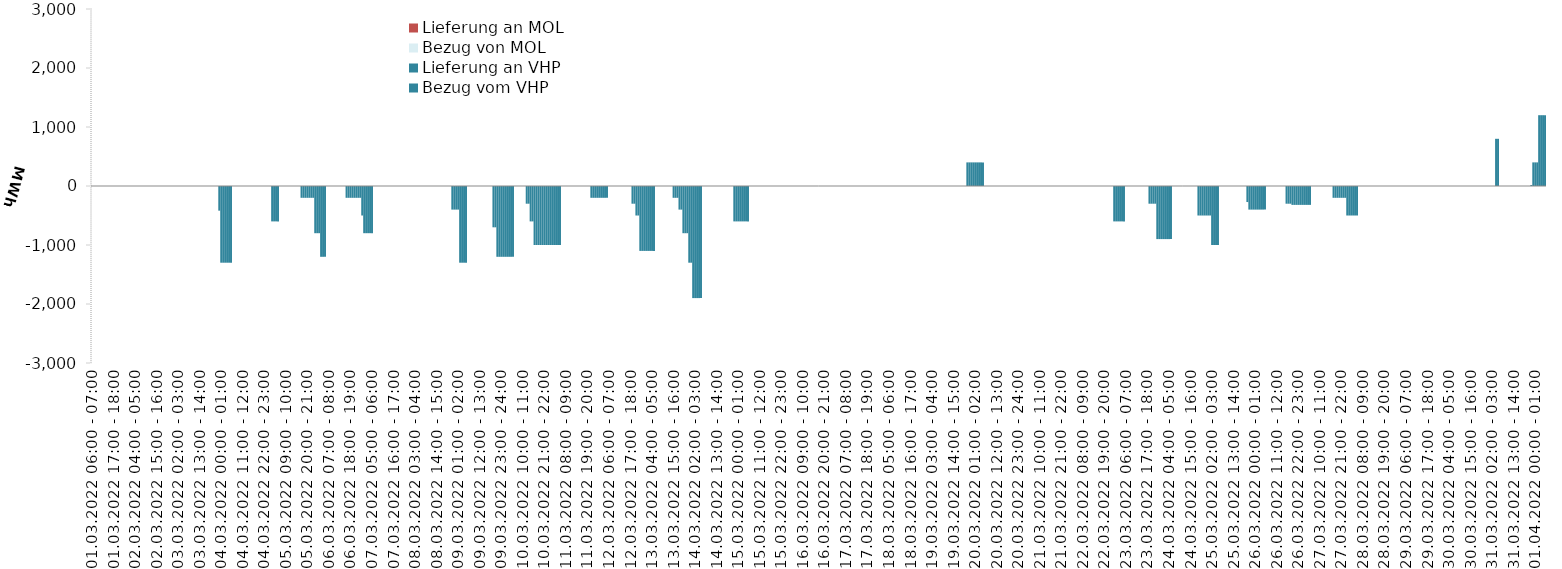
| Category | Bezug vom VHP | Lieferung an VHP | Bezug von MOL | Lieferung an MOL |
|---|---|---|---|---|
| 01.03.2022 06:00 - 07:00 | 0 | 0 | 0 | 0 |
| 01.03.2022 07:00 - 08:00 | 0 | 0 | 0 | 0 |
| 01.03.2022 08:00 - 09:00 | 0 | 0 | 0 | 0 |
| 01.03.2022 09:00 - 10:00 | 0 | 0 | 0 | 0 |
| 01.03.2022 10:00 - 11:00 | 0 | 0 | 0 | 0 |
| 01.03.2022 11:00 - 12:00 | 0 | 0 | 0 | 0 |
| 01.03.2022 12:00 - 13:00 | 0 | 0 | 0 | 0 |
| 01.03.2022 13:00 - 14:00 | 0 | 0 | 0 | 0 |
| 01.03.2022 14:00 - 15:00 | 0 | 0 | 0 | 0 |
| 01.03.2022 15:00 - 16:00 | 0 | 0 | 0 | 0 |
| 01.03.2022 16:00 - 17:00 | 0 | 0 | 0 | 0 |
| 01.03.2022 17:00 - 18:00 | 0 | 0 | 0 | 0 |
| 01.03.2022 18:00 - 19:00 | 0 | 0 | 0 | 0 |
| 01.03.2022 19:00 - 20:00 | 0 | 0 | 0 | 0 |
| 01.03.2022 20:00 - 21:00 | 0 | 0 | 0 | 0 |
| 01.03.2022 21:00 - 22:00 | 0 | 0 | 0 | 0 |
| 01.03.2022 22:00 - 23:00 | 0 | 0 | 0 | 0 |
| 01.03.2022 23:00 - 24:00 | 0 | 0 | 0 | 0 |
| 02.03.2022 00:00 - 01:00 | 0 | 0 | 0 | 0 |
| 02.03.2022 01:00 - 02:00 | 0 | 0 | 0 | 0 |
| 02.03.2022 02:00 - 03:00 | 0 | 0 | 0 | 0 |
| 02.03.2022 03:00 - 04:00 | 0 | 0 | 0 | 0 |
| 02.03.2022 04:00 - 05:00 | 0 | 0 | 0 | 0 |
| 02.03.2022 05:00 - 06:00 | 0 | 0 | 0 | 0 |
| 02.03.2022 06:00 - 07:00 | 0 | 0 | 0 | 0 |
| 02.03.2022 07:00 - 08:00 | 0 | 0 | 0 | 0 |
| 02.03.2022 08:00 - 09:00 | 0 | 0 | 0 | 0 |
| 02.03.2022 09:00 - 10:00 | 0 | 0 | 0 | 0 |
| 02.03.2022 10:00 - 11:00 | 0 | 0 | 0 | 0 |
| 02.03.2022 11:00 - 12:00 | 0 | 0 | 0 | 0 |
| 02.03.2022 12:00 - 13:00 | 0 | 0 | 0 | 0 |
| 02.03.2022 13:00 - 14:00 | 0 | 0 | 0 | 0 |
| 02.03.2022 14:00 - 15:00 | 0 | 0 | 0 | 0 |
| 02.03.2022 15:00 - 16:00 | 0 | 0 | 0 | 0 |
| 02.03.2022 16:00 - 17:00 | 0 | 0 | 0 | 0 |
| 02.03.2022 17:00 - 18:00 | 0 | 0 | 0 | 0 |
| 02.03.2022 18:00 - 19:00 | 0 | 0 | 0 | 0 |
| 02.03.2022 19:00 - 20:00 | 0 | 0 | 0 | 0 |
| 02.03.2022 20:00 - 21:00 | 0 | 0 | 0 | 0 |
| 02.03.2022 21:00 - 22:00 | 0 | 0 | 0 | 0 |
| 02.03.2022 22:00 - 23:00 | 0 | 0 | 0 | 0 |
| 02.03.2022 23:00 - 24:00 | 0 | 0 | 0 | 0 |
| 03.03.2022 00:00 - 01:00 | 0 | 0 | 0 | 0 |
| 03.03.2022 01:00 - 02:00 | 0 | 0 | 0 | 0 |
| 03.03.2022 02:00 - 03:00 | 0 | 0 | 0 | 0 |
| 03.03.2022 03:00 - 04:00 | 0 | 0 | 0 | 0 |
| 03.03.2022 04:00 - 05:00 | 0 | 0 | 0 | 0 |
| 03.03.2022 05:00 - 06:00 | 0 | 0 | 0 | 0 |
| 03.03.2022 06:00 - 07:00 | 0 | 0 | 0 | 0 |
| 03.03.2022 07:00 - 08:00 | 0 | 0 | 0 | 0 |
| 03.03.2022 08:00 - 09:00 | 0 | 0 | 0 | 0 |
| 03.03.2022 09:00 - 10:00 | 0 | 0 | 0 | 0 |
| 03.03.2022 10:00 - 11:00 | 0 | 0 | 0 | 0 |
| 03.03.2022 11:00 - 12:00 | 0 | 0 | 0 | 0 |
| 03.03.2022 12:00 - 13:00 | 0 | 0 | 0 | 0 |
| 03.03.2022 13:00 - 14:00 | 0 | 0 | 0 | 0 |
| 03.03.2022 14:00 - 15:00 | 0 | 0 | 0 | 0 |
| 03.03.2022 15:00 - 16:00 | 0 | 0 | 0 | 0 |
| 03.03.2022 16:00 - 17:00 | 0 | 0 | 0 | 0 |
| 03.03.2022 17:00 - 18:00 | 0 | 0 | 0 | 0 |
| 03.03.2022 18:00 - 19:00 | 0 | 0 | 0 | 0 |
| 03.03.2022 19:00 - 20:00 | 0 | 0 | 0 | 0 |
| 03.03.2022 20:00 - 21:00 | 0 | 0 | 0 | 0 |
| 03.03.2022 21:00 - 22:00 | 0 | 0 | 0 | 0 |
| 03.03.2022 22:00 - 23:00 | 0 | 0 | 0 | 0 |
| 03.03.2022 23:00 - 24:00 | 0 | -418 | 0 | 0 |
| 04.03.2022 00:00 - 01:00 | 0 | -1300 | 0 | 0 |
| 04.03.2022 01:00 - 02:00 | 0 | -1300 | 0 | 0 |
| 04.03.2022 02:00 - 03:00 | 0 | -1300 | 0 | 0 |
| 04.03.2022 03:00 - 04:00 | 0 | -1300 | 0 | 0 |
| 04.03.2022 04:00 - 05:00 | 0 | -1300 | 0 | 0 |
| 04.03.2022 05:00 - 06:00 | 0 | -1300 | 0 | 0 |
| 04.03.2022 06:00 - 07:00 | 0 | 0 | 0 | 0 |
| 04.03.2022 07:00 - 08:00 | 0 | 0 | 0 | 0 |
| 04.03.2022 08:00 - 09:00 | 0 | 0 | 0 | 0 |
| 04.03.2022 09:00 - 10:00 | 0 | 0 | 0 | 0 |
| 04.03.2022 10:00 - 11:00 | 0 | 0 | 0 | 0 |
| 04.03.2022 11:00 - 12:00 | 0 | 0 | 0 | 0 |
| 04.03.2022 12:00 - 13:00 | 0 | 0 | 0 | 0 |
| 04.03.2022 13:00 - 14:00 | 0 | 0 | 0 | 0 |
| 04.03.2022 14:00 - 15:00 | 0 | 0 | 0 | 0 |
| 04.03.2022 15:00 - 16:00 | 0 | 0 | 0 | 0 |
| 04.03.2022 16:00 - 17:00 | 0 | 0 | 0 | 0 |
| 04.03.2022 17:00 - 18:00 | 0 | 0 | 0 | 0 |
| 04.03.2022 18:00 - 19:00 | 0 | 0 | 0 | 0 |
| 04.03.2022 19:00 - 20:00 | 0 | 0 | 0 | 0 |
| 04.03.2022 20:00 - 21:00 | 0 | 0 | 0 | 0 |
| 04.03.2022 21:00 - 22:00 | 0 | 0 | 0 | 0 |
| 04.03.2022 22:00 - 23:00 | 0 | 0 | 0 | 0 |
| 04.03.2022 23:00 - 24:00 | 0 | 0 | 0 | 0 |
| 05.03.2022 00:00 - 01:00 | 0 | 0 | 0 | 0 |
| 05.03.2022 01:00 - 02:00 | 0 | 0 | 0 | 0 |
| 05.03.2022 02:00 - 03:00 | 0 | -600 | 0 | 0 |
| 05.03.2022 03:00 - 04:00 | 0 | -600 | 0 | 0 |
| 05.03.2022 04:00 - 05:00 | 0 | -600 | 0 | 0 |
| 05.03.2022 05:00 - 06:00 | 0 | -600 | 0 | 0 |
| 05.03.2022 06:00 - 07:00 | 0 | 0 | 0 | 0 |
| 05.03.2022 07:00 - 08:00 | 0 | 0 | 0 | 0 |
| 05.03.2022 08:00 - 09:00 | 0 | 0 | 0 | 0 |
| 05.03.2022 09:00 - 10:00 | 0 | 0 | 0 | 0 |
| 05.03.2022 10:00 - 11:00 | 0 | 0 | 0 | 0 |
| 05.03.2022 11:00 - 12:00 | 0 | 0 | 0 | 0 |
| 05.03.2022 12:00 - 13:00 | 0 | 0 | 0 | 0 |
| 05.03.2022 13:00 - 14:00 | 0 | 0 | 0 | 0 |
| 05.03.2022 14:00 - 15:00 | 0 | 0 | 0 | 0 |
| 05.03.2022 15:00 - 16:00 | 0 | 0 | 0 | 0 |
| 05.03.2022 16:00 - 17:00 | 0 | 0 | 0 | 0 |
| 05.03.2022 17:00 - 18:00 | 0 | -200 | 0 | 0 |
| 05.03.2022 18:00 - 19:00 | 0 | -200 | 0 | 0 |
| 05.03.2022 19:00 - 20:00 | 0 | -200 | 0 | 0 |
| 05.03.2022 20:00 - 21:00 | 0 | -200 | 0 | 0 |
| 05.03.2022 21:00 - 22:00 | 0 | -200 | 0 | 0 |
| 05.03.2022 22:00 - 23:00 | 0 | -200 | 0 | 0 |
| 05.03.2022 23:00 - 24:00 | 0 | -200 | 0 | 0 |
| 06.03.2022 00:00 - 01:00 | 0 | -800 | 0 | 0 |
| 06.03.2022 01:00 - 02:00 | 0 | -800 | 0 | 0 |
| 06.03.2022 02:00 - 03:00 | 0 | -800 | 0 | 0 |
| 06.03.2022 03:00 - 04:00 | 0 | -1200 | 0 | 0 |
| 06.03.2022 04:00 - 05:00 | 0 | -1200 | 0 | 0 |
| 06.03.2022 05:00 - 06:00 | 0 | -1200 | 0 | 0 |
| 06.03.2022 06:00 - 07:00 | 0 | 0 | 0 | 0 |
| 06.03.2022 07:00 - 08:00 | 0 | 0 | 0 | 0 |
| 06.03.2022 08:00 - 09:00 | 0 | 0 | 0 | 0 |
| 06.03.2022 09:00 - 10:00 | 0 | 0 | 0 | 0 |
| 06.03.2022 10:00 - 11:00 | 0 | 0 | 0 | 0 |
| 06.03.2022 11:00 - 12:00 | 0 | 0 | 0 | 0 |
| 06.03.2022 12:00 - 13:00 | 0 | 0 | 0 | 0 |
| 06.03.2022 13:00 - 14:00 | 0 | 0 | 0 | 0 |
| 06.03.2022 14:00 - 15:00 | 0 | 0 | 0 | 0 |
| 06.03.2022 15:00 - 16:00 | 0 | 0 | 0 | 0 |
| 06.03.2022 16:00 - 17:00 | 0 | -200 | 0 | 0 |
| 06.03.2022 17:00 - 18:00 | 0 | -200 | 0 | 0 |
| 06.03.2022 18:00 - 19:00 | 0 | -200 | 0 | 0 |
| 06.03.2022 19:00 - 20:00 | 0 | -200 | 0 | 0 |
| 06.03.2022 20:00 - 21:00 | 0 | -200 | 0 | 0 |
| 06.03.2022 21:00 - 22:00 | 0 | -200 | 0 | 0 |
| 06.03.2022 22:00 - 23:00 | 0 | -200 | 0 | 0 |
| 06.03.2022 23:00 - 24:00 | 0 | -200 | 0 | 0 |
| 07.03.2022 00:00 - 01:00 | 0 | -500 | 0 | 0 |
| 07.03.2022 01:00 - 02:00 | 0 | -800 | 0 | 0 |
| 07.03.2022 02:00 - 03:00 | 0 | -800 | 0 | 0 |
| 07.03.2022 03:00 - 04:00 | 0 | -800 | 0 | 0 |
| 07.03.2022 04:00 - 05:00 | 0 | -800 | 0 | 0 |
| 07.03.2022 05:00 - 06:00 | 0 | -800 | 0 | 0 |
| 07.03.2022 06:00 - 07:00 | 0 | 0 | 0 | 0 |
| 07.03.2022 07:00 - 08:00 | 0 | 0 | 0 | 0 |
| 07.03.2022 08:00 - 09:00 | 0 | 0 | 0 | 0 |
| 07.03.2022 09:00 - 10:00 | 0 | 0 | 0 | 0 |
| 07.03.2022 10:00 - 11:00 | 0 | 0 | 0 | 0 |
| 07.03.2022 11:00 - 12:00 | 0 | 0 | 0 | 0 |
| 07.03.2022 12:00 - 13:00 | 0 | 0 | 0 | 0 |
| 07.03.2022 13:00 - 14:00 | 0 | 0 | 0 | 0 |
| 07.03.2022 14:00 - 15:00 | 0 | 0 | 0 | 0 |
| 07.03.2022 15:00 - 16:00 | 0 | 0 | 0 | 0 |
| 07.03.2022 16:00 - 17:00 | 0 | 0 | 0 | 0 |
| 07.03.2022 17:00 - 18:00 | 0 | 0 | 0 | 0 |
| 07.03.2022 18:00 - 19:00 | 0 | 0 | 0 | 0 |
| 07.03.2022 19:00 - 20:00 | 0 | 0 | 0 | 0 |
| 07.03.2022 20:00 - 21:00 | 0 | 0 | 0 | 0 |
| 07.03.2022 21:00 - 22:00 | 0 | 0 | 0 | 0 |
| 07.03.2022 22:00 - 23:00 | 0 | 0 | 0 | 0 |
| 07.03.2022 23:00 - 24:00 | 0 | 0 | 0 | 0 |
| 08.03.2022 00:00 - 01:00 | 0 | 0 | 0 | 0 |
| 08.03.2022 01:00 - 02:00 | 0 | 0 | 0 | 0 |
| 08.03.2022 02:00 - 03:00 | 0 | 0 | 0 | 0 |
| 08.03.2022 03:00 - 04:00 | 0 | 0 | 0 | 0 |
| 08.03.2022 04:00 - 05:00 | 0 | 0 | 0 | 0 |
| 08.03.2022 05:00 - 06:00 | 0 | 0 | 0 | 0 |
| 08.03.2022 06:00 - 07:00 | 0 | 0 | 0 | 0 |
| 08.03.2022 07:00 - 08:00 | 0 | 0 | 0 | 0 |
| 08.03.2022 08:00 - 09:00 | 0 | 0 | 0 | 0 |
| 08.03.2022 09:00 - 10:00 | 0 | 0 | 0 | 0 |
| 08.03.2022 10:00 - 11:00 | 0 | 0 | 0 | 0 |
| 08.03.2022 11:00 - 12:00 | 0 | 0 | 0 | 0 |
| 08.03.2022 12:00 - 13:00 | 0 | 0 | 0 | 0 |
| 08.03.2022 13:00 - 14:00 | 0 | 0 | 0 | 0 |
| 08.03.2022 14:00 - 15:00 | 0 | 0 | 0 | 0 |
| 08.03.2022 15:00 - 16:00 | 0 | 0 | 0 | 0 |
| 08.03.2022 16:00 - 17:00 | 0 | 0 | 0 | 0 |
| 08.03.2022 17:00 - 18:00 | 0 | 0 | 0 | 0 |
| 08.03.2022 18:00 - 19:00 | 0 | 0 | 0 | 0 |
| 08.03.2022 19:00 - 20:00 | 0 | 0 | 0 | 0 |
| 08.03.2022 20:00 - 21:00 | 0 | 0 | 0 | 0 |
| 08.03.2022 21:00 - 22:00 | 0 | 0 | 0 | 0 |
| 08.03.2022 22:00 - 23:00 | 0 | -400 | 0 | 0 |
| 08.03.2022 23:00 - 24:00 | 0 | -400 | 0 | 0 |
| 09.03.2022 00:00 - 01:00 | 0 | -400 | 0 | 0 |
| 09.03.2022 01:00 - 02:00 | 0 | -400 | 0 | 0 |
| 09.03.2022 02:00 - 03:00 | 0 | -1300 | 0 | 0 |
| 09.03.2022 03:00 - 04:00 | 0 | -1300 | 0 | 0 |
| 09.03.2022 04:00 - 05:00 | 0 | -1300 | 0 | 0 |
| 09.03.2022 05:00 - 06:00 | 0 | -1300 | 0 | 0 |
| 09.03.2022 06:00 - 07:00 | 0 | 0 | 0 | 0 |
| 09.03.2022 07:00 - 08:00 | 0 | 0 | 0 | 0 |
| 09.03.2022 08:00 - 09:00 | 0 | 0 | 0 | 0 |
| 09.03.2022 09:00 - 10:00 | 0 | 0 | 0 | 0 |
| 09.03.2022 10:00 - 11:00 | 0 | 0 | 0 | 0 |
| 09.03.2022 11:00 - 12:00 | 0 | 0 | 0 | 0 |
| 09.03.2022 12:00 - 13:00 | 0 | 0 | 0 | 0 |
| 09.03.2022 13:00 - 14:00 | 0 | 0 | 0 | 0 |
| 09.03.2022 14:00 - 15:00 | 0 | 0 | 0 | 0 |
| 09.03.2022 15:00 - 16:00 | 0 | 0 | 0 | 0 |
| 09.03.2022 16:00 - 17:00 | 0 | 0 | 0 | 0 |
| 09.03.2022 17:00 - 18:00 | 0 | 0 | 0 | 0 |
| 09.03.2022 18:00 - 19:00 | 0 | 0 | 0 | 0 |
| 09.03.2022 19:00 - 20:00 | 0 | -700 | 0 | 0 |
| 09.03.2022 20:00 - 21:00 | 0 | -700 | 0 | 0 |
| 09.03.2022 21:00 - 22:00 | 0 | -1200 | 0 | 0 |
| 09.03.2022 22:00 - 23:00 | 0 | -1200 | 0 | 0 |
| 09.03.2022 23:00 - 24:00 | 0 | -1200 | 0 | 0 |
| 10.03.2022 00:00 - 01:00 | 0 | -1200 | 0 | 0 |
| 10.03.2022 01:00 - 02:00 | 0 | -1200 | 0 | 0 |
| 10.03.2022 02:00 - 03:00 | 0 | -1200 | 0 | 0 |
| 10.03.2022 03:00 - 04:00 | 0 | -1200 | 0 | 0 |
| 10.03.2022 04:00 - 05:00 | 0 | -1200 | 0 | 0 |
| 10.03.2022 05:00 - 06:00 | 0 | -1200 | 0 | 0 |
| 10.03.2022 06:00 - 07:00 | 0 | 0 | 0 | 0 |
| 10.03.2022 07:00 - 08:00 | 0 | 0 | 0 | 0 |
| 10.03.2022 08:00 - 09:00 | 0 | 0 | 0 | 0 |
| 10.03.2022 09:00 - 10:00 | 0 | 0 | 0 | 0 |
| 10.03.2022 10:00 - 11:00 | 0 | 0 | 0 | 0 |
| 10.03.2022 11:00 - 12:00 | 0 | 0 | 0 | 0 |
| 10.03.2022 12:00 - 13:00 | 0 | -300 | 0 | 0 |
| 10.03.2022 13:00 - 14:00 | 0 | -300 | 0 | 0 |
| 10.03.2022 14:00 - 15:00 | 0 | -600 | 0 | 0 |
| 10.03.2022 15:00 - 16:00 | 0 | -600 | 0 | 0 |
| 10.03.2022 16:00 - 17:00 | 0 | -1000 | 0 | 0 |
| 10.03.2022 17:00 - 18:00 | 0 | -1000 | 0 | 0 |
| 10.03.2022 18:00 - 19:00 | 0 | -1000 | 0 | 0 |
| 10.03.2022 19:00 - 20:00 | 0 | -1000 | 0 | 0 |
| 10.03.2022 20:00 - 21:00 | 0 | -1000 | 0 | 0 |
| 10.03.2022 21:00 - 22:00 | 0 | -1000 | 0 | 0 |
| 10.03.2022 22:00 - 23:00 | 0 | -1000 | 0 | 0 |
| 10.03.2022 23:00 - 24:00 | 0 | -1000 | 0 | 0 |
| 11.03.2022 00:00 - 01:00 | 0 | -1000 | 0 | 0 |
| 11.03.2022 01:00 - 02:00 | 0 | -1000 | 0 | 0 |
| 11.03.2022 02:00 - 03:00 | 0 | -1000 | 0 | 0 |
| 11.03.2022 03:00 - 04:00 | 0 | -1000 | 0 | 0 |
| 11.03.2022 04:00 - 05:00 | 0 | -1000 | 0 | 0 |
| 11.03.2022 05:00 - 06:00 | 0 | -1000 | 0 | 0 |
| 11.03.2022 06:00 - 07:00 | 0 | 0 | 0 | 0 |
| 11.03.2022 07:00 - 08:00 | 0 | 0 | 0 | 0 |
| 11.03.2022 08:00 - 09:00 | 0 | 0 | 0 | 0 |
| 11.03.2022 09:00 - 10:00 | 0 | 0 | 0 | 0 |
| 11.03.2022 10:00 - 11:00 | 0 | 0 | 0 | 0 |
| 11.03.2022 11:00 - 12:00 | 0 | 0 | 0 | 0 |
| 11.03.2022 12:00 - 13:00 | 0 | 0 | 0 | 0 |
| 11.03.2022 13:00 - 14:00 | 0 | 0 | 0 | 0 |
| 11.03.2022 14:00 - 15:00 | 0 | 0 | 0 | 0 |
| 11.03.2022 15:00 - 16:00 | 0 | 0 | 0 | 0 |
| 11.03.2022 16:00 - 17:00 | 0 | 0 | 0 | 0 |
| 11.03.2022 17:00 - 18:00 | 0 | 0 | 0 | 0 |
| 11.03.2022 18:00 - 19:00 | 0 | 0 | 0 | 0 |
| 11.03.2022 19:00 - 20:00 | 0 | 0 | 0 | 0 |
| 11.03.2022 20:00 - 21:00 | 0 | 0 | 0 | 0 |
| 11.03.2022 21:00 - 22:00 | 0 | -200 | 0 | 0 |
| 11.03.2022 22:00 - 23:00 | 0 | -200 | 0 | 0 |
| 11.03.2022 23:00 - 24:00 | 0 | -200 | 0 | 0 |
| 12.03.2022 00:00 - 01:00 | 0 | -200 | 0 | 0 |
| 12.03.2022 01:00 - 02:00 | 0 | -200 | 0 | 0 |
| 12.03.2022 02:00 - 03:00 | 0 | -200 | 0 | 0 |
| 12.03.2022 03:00 - 04:00 | 0 | -200 | 0 | 0 |
| 12.03.2022 04:00 - 05:00 | 0 | -200 | 0 | 0 |
| 12.03.2022 05:00 - 06:00 | 0 | -200 | 0 | 0 |
| 12.03.2022 06:00 - 07:00 | 0 | 0 | 0 | 0 |
| 12.03.2022 07:00 - 08:00 | 0 | 0 | 0 | 0 |
| 12.03.2022 08:00 - 09:00 | 0 | 0 | 0 | 0 |
| 12.03.2022 09:00 - 10:00 | 0 | 0 | 0 | 0 |
| 12.03.2022 10:00 - 11:00 | 0 | 0 | 0 | 0 |
| 12.03.2022 11:00 - 12:00 | 0 | 0 | 0 | 0 |
| 12.03.2022 12:00 - 13:00 | 0 | 0 | 0 | 0 |
| 12.03.2022 13:00 - 14:00 | 0 | 0 | 0 | 0 |
| 12.03.2022 14:00 - 15:00 | 0 | 0 | 0 | 0 |
| 12.03.2022 15:00 - 16:00 | 0 | 0 | 0 | 0 |
| 12.03.2022 16:00 - 17:00 | 0 | 0 | 0 | 0 |
| 12.03.2022 17:00 - 18:00 | 0 | 0 | 0 | 0 |
| 12.03.2022 18:00 - 19:00 | 0 | -300 | 0 | 0 |
| 12.03.2022 19:00 - 20:00 | 0 | -300 | 0 | 0 |
| 12.03.2022 20:00 - 21:00 | 0 | -500 | 0 | 0 |
| 12.03.2022 21:00 - 22:00 | 0 | -500 | 0 | 0 |
| 12.03.2022 22:00 - 23:00 | 0 | -1100 | 0 | 0 |
| 12.03.2022 23:00 - 24:00 | 0 | -1100 | 0 | 0 |
| 13.03.2022 00:00 - 01:00 | 0 | -1100 | 0 | 0 |
| 13.03.2022 01:00 - 02:00 | 0 | -1100 | 0 | 0 |
| 13.03.2022 02:00 - 03:00 | 0 | -1100 | 0 | 0 |
| 13.03.2022 03:00 - 04:00 | 0 | -1100 | 0 | 0 |
| 13.03.2022 04:00 - 05:00 | 0 | -1100 | 0 | 0 |
| 13.03.2022 05:00 - 06:00 | 0 | -1100 | 0 | 0 |
| 13.03.2022 06:00 - 07:00 | 0 | 0 | 0 | 0 |
| 13.03.2022 07:00 - 08:00 | 0 | 0 | 0 | 0 |
| 13.03.2022 08:00 - 09:00 | 0 | 0 | 0 | 0 |
| 13.03.2022 09:00 - 10:00 | 0 | 0 | 0 | 0 |
| 13.03.2022 10:00 - 11:00 | 0 | 0 | 0 | 0 |
| 13.03.2022 11:00 - 12:00 | 0 | 0 | 0 | 0 |
| 13.03.2022 12:00 - 13:00 | 0 | 0 | 0 | 0 |
| 13.03.2022 13:00 - 14:00 | 0 | 0 | 0 | 0 |
| 13.03.2022 14:00 - 15:00 | 0 | 0 | 0 | 0 |
| 13.03.2022 15:00 - 16:00 | 0 | -200 | 0 | 0 |
| 13.03.2022 16:00 - 17:00 | 0 | -200 | 0 | 0 |
| 13.03.2022 17:00 - 18:00 | 0 | -200 | 0 | 0 |
| 13.03.2022 18:00 - 19:00 | 0 | -400 | 0 | 0 |
| 13.03.2022 19:00 - 20:00 | 0 | -400 | 0 | 0 |
| 13.03.2022 20:00 - 21:00 | 0 | -800 | 0 | 0 |
| 13.03.2022 21:00 - 22:00 | 0 | -800 | 0 | 0 |
| 13.03.2022 22:00 - 23:00 | 0 | -800 | 0 | 0 |
| 13.03.2022 23:00 - 24:00 | 0 | -1300 | 0 | 0 |
| 14.03.2022 00:00 - 01:00 | 0 | -1300 | 0 | 0 |
| 14.03.2022 01:00 - 02:00 | 0 | -1900 | 0 | 0 |
| 14.03.2022 02:00 - 03:00 | 0 | -1900 | 0 | 0 |
| 14.03.2022 03:00 - 04:00 | 0 | -1900 | 0 | 0 |
| 14.03.2022 04:00 - 05:00 | 0 | -1900 | 0 | 0 |
| 14.03.2022 05:00 - 06:00 | 0 | -1900 | 0 | 0 |
| 14.03.2022 06:00 - 07:00 | 0 | 0 | 0 | 0 |
| 14.03.2022 07:00 - 08:00 | 0 | 0 | 0 | 0 |
| 14.03.2022 08:00 - 09:00 | 0 | 0 | 0 | 0 |
| 14.03.2022 09:00 - 10:00 | 0 | 0 | 0 | 0 |
| 14.03.2022 10:00 - 11:00 | 0 | 0 | 0 | 0 |
| 14.03.2022 11:00 - 12:00 | 0 | 0 | 0 | 0 |
| 14.03.2022 12:00 - 13:00 | 0 | 0 | 0 | 0 |
| 14.03.2022 13:00 - 14:00 | 0 | 0 | 0 | 0 |
| 14.03.2022 14:00 - 15:00 | 0 | 0 | 0 | 0 |
| 14.03.2022 15:00 - 16:00 | 0 | 0 | 0 | 0 |
| 14.03.2022 16:00 - 17:00 | 0 | 0 | 0 | 0 |
| 14.03.2022 17:00 - 18:00 | 0 | 0 | 0 | 0 |
| 14.03.2022 18:00 - 19:00 | 0 | 0 | 0 | 0 |
| 14.03.2022 19:00 - 20:00 | 0 | 0 | 0 | 0 |
| 14.03.2022 20:00 - 21:00 | 0 | 0 | 0 | 0 |
| 14.03.2022 21:00 - 22:00 | 0 | 0 | 0 | 0 |
| 14.03.2022 22:00 - 23:00 | 0 | -600 | 0 | 0 |
| 14.03.2022 23:00 - 24:00 | 0 | -600 | 0 | 0 |
| 15.03.2022 00:00 - 01:00 | 0 | -600 | 0 | 0 |
| 15.03.2022 01:00 - 02:00 | 0 | -600 | 0 | 0 |
| 15.03.2022 02:00 - 03:00 | 0 | -600 | 0 | 0 |
| 15.03.2022 03:00 - 04:00 | 0 | -600 | 0 | 0 |
| 15.03.2022 04:00 - 05:00 | 0 | -600 | 0 | 0 |
| 15.03.2022 05:00 - 06:00 | 0 | -600 | 0 | 0 |
| 15.03.2022 06:00 - 07:00 | 0 | 0 | 0 | 0 |
| 15.03.2022 07:00 - 08:00 | 0 | 0 | 0 | 0 |
| 15.03.2022 08:00 - 09:00 | 0 | 0 | 0 | 0 |
| 15.03.2022 09:00 - 10:00 | 0 | 0 | 0 | 0 |
| 15.03.2022 10:00 - 11:00 | 0 | 0 | 0 | 0 |
| 15.03.2022 11:00 - 12:00 | 0 | 0 | 0 | 0 |
| 15.03.2022 12:00 - 13:00 | 0 | 0 | 0 | 0 |
| 15.03.2022 13:00 - 14:00 | 0 | 0 | 0 | 0 |
| 15.03.2022 14:00 - 15:00 | 0 | 0 | 0 | 0 |
| 15.03.2022 15:00 - 16:00 | 0 | 0 | 0 | 0 |
| 15.03.2022 16:00 - 17:00 | 0 | 0 | 0 | 0 |
| 15.03.2022 17:00 - 18:00 | 0 | 0 | 0 | 0 |
| 15.03.2022 18:00 - 19:00 | 0 | 0 | 0 | 0 |
| 15.03.2022 19:00 - 20:00 | 0 | 0 | 0 | 0 |
| 15.03.2022 20:00 - 21:00 | 0 | 0 | 0 | 0 |
| 15.03.2022 21:00 - 22:00 | 0 | 0 | 0 | 0 |
| 15.03.2022 22:00 - 23:00 | 0 | 0 | 0 | 0 |
| 15.03.2022 23:00 - 24:00 | 0 | 0 | 0 | 0 |
| 16.03.2022 00:00 - 01:00 | 0 | 0 | 0 | 0 |
| 16.03.2022 01:00 - 02:00 | 0 | 0 | 0 | 0 |
| 16.03.2022 02:00 - 03:00 | 0 | 0 | 0 | 0 |
| 16.03.2022 03:00 - 04:00 | 0 | 0 | 0 | 0 |
| 16.03.2022 04:00 - 05:00 | 0 | 0 | 0 | 0 |
| 16.03.2022 05:00 - 06:00 | 0 | 0 | 0 | 0 |
| 16.03.2022 06:00 - 07:00 | 0 | 0 | 0 | 0 |
| 16.03.2022 07:00 - 08:00 | 0 | 0 | 0 | 0 |
| 16.03.2022 08:00 - 09:00 | 0 | 0 | 0 | 0 |
| 16.03.2022 09:00 - 10:00 | 0 | 0 | 0 | 0 |
| 16.03.2022 10:00 - 11:00 | 0 | 0 | 0 | 0 |
| 16.03.2022 11:00 - 12:00 | 0 | 0 | 0 | 0 |
| 16.03.2022 12:00 - 13:00 | 0 | 0 | 0 | 0 |
| 16.03.2022 13:00 - 14:00 | 0 | 0 | 0 | 0 |
| 16.03.2022 14:00 - 15:00 | 0 | 0 | 0 | 0 |
| 16.03.2022 15:00 - 16:00 | 0 | 0 | 0 | 0 |
| 16.03.2022 16:00 - 17:00 | 0 | 0 | 0 | 0 |
| 16.03.2022 17:00 - 18:00 | 0 | 0 | 0 | 0 |
| 16.03.2022 18:00 - 19:00 | 0 | 0 | 0 | 0 |
| 16.03.2022 19:00 - 20:00 | 0 | 0 | 0 | 0 |
| 16.03.2022 20:00 - 21:00 | 0 | 0 | 0 | 0 |
| 16.03.2022 21:00 - 22:00 | 0 | 0 | 0 | 0 |
| 16.03.2022 22:00 - 23:00 | 0 | 0 | 0 | 0 |
| 16.03.2022 23:00 - 24:00 | 0 | 0 | 0 | 0 |
| 17.03.2022 00:00 - 01:00 | 0 | 0 | 0 | 0 |
| 17.03.2022 01:00 - 02:00 | 0 | 0 | 0 | 0 |
| 17.03.2022 02:00 - 03:00 | 0 | 0 | 0 | 0 |
| 17.03.2022 03:00 - 04:00 | 0 | 0 | 0 | 0 |
| 17.03.2022 04:00 - 05:00 | 0 | 0 | 0 | 0 |
| 17.03.2022 05:00 - 06:00 | 0 | 0 | 0 | 0 |
| 17.03.2022 06:00 - 07:00 | 0 | 0 | 0 | 0 |
| 17.03.2022 07:00 - 08:00 | 0 | 0 | 0 | 0 |
| 17.03.2022 08:00 - 09:00 | 0 | 0 | 0 | 0 |
| 17.03.2022 09:00 - 10:00 | 0 | 0 | 0 | 0 |
| 17.03.2022 10:00 - 11:00 | 0 | 0 | 0 | 0 |
| 17.03.2022 11:00 - 12:00 | 0 | 0 | 0 | 0 |
| 17.03.2022 12:00 - 13:00 | 0 | 0 | 0 | 0 |
| 17.03.2022 13:00 - 14:00 | 0 | 0 | 0 | 0 |
| 17.03.2022 14:00 - 15:00 | 0 | 0 | 0 | 0 |
| 17.03.2022 15:00 - 16:00 | 0 | 0 | 0 | 0 |
| 17.03.2022 16:00 - 17:00 | 0 | 0 | 0 | 0 |
| 17.03.2022 17:00 - 18:00 | 0 | 0 | 0 | 0 |
| 17.03.2022 18:00 - 19:00 | 0 | 0 | 0 | 0 |
| 17.03.2022 19:00 - 20:00 | 0 | 0 | 0 | 0 |
| 17.03.2022 20:00 - 21:00 | 0 | 0 | 0 | 0 |
| 17.03.2022 21:00 - 22:00 | 0 | 0 | 0 | 0 |
| 17.03.2022 22:00 - 23:00 | 0 | 0 | 0 | 0 |
| 17.03.2022 23:00 - 24:00 | 0 | 0 | 0 | 0 |
| 18.03.2022 00:00 - 01:00 | 0 | 0 | 0 | 0 |
| 18.03.2022 01:00 - 02:00 | 0 | 0 | 0 | 0 |
| 18.03.2022 02:00 - 03:00 | 0 | 0 | 0 | 0 |
| 18.03.2022 03:00 - 04:00 | 0 | 0 | 0 | 0 |
| 18.03.2022 04:00 - 05:00 | 0 | 0 | 0 | 0 |
| 18.03.2022 05:00 - 06:00 | 0 | 0 | 0 | 0 |
| 18.03.2022 06:00 - 07:00 | 0 | 0 | 0 | 0 |
| 18.03.2022 07:00 - 08:00 | 0 | 0 | 0 | 0 |
| 18.03.2022 08:00 - 09:00 | 0 | 0 | 0 | 0 |
| 18.03.2022 09:00 - 10:00 | 0 | 0 | 0 | 0 |
| 18.03.2022 10:00 - 11:00 | 0 | 0 | 0 | 0 |
| 18.03.2022 11:00 - 12:00 | 0 | 0 | 0 | 0 |
| 18.03.2022 12:00 - 13:00 | 0 | 0 | 0 | 0 |
| 18.03.2022 13:00 - 14:00 | 0 | 0 | 0 | 0 |
| 18.03.2022 14:00 - 15:00 | 0 | 0 | 0 | 0 |
| 18.03.2022 15:00 - 16:00 | 0 | 0 | 0 | 0 |
| 18.03.2022 16:00 - 17:00 | 0 | 0 | 0 | 0 |
| 18.03.2022 17:00 - 18:00 | 0 | 0 | 0 | 0 |
| 18.03.2022 18:00 - 19:00 | 0 | 0 | 0 | 0 |
| 18.03.2022 19:00 - 20:00 | 0 | 0 | 0 | 0 |
| 18.03.2022 20:00 - 21:00 | 0 | 0 | 0 | 0 |
| 18.03.2022 21:00 - 22:00 | 0 | 0 | 0 | 0 |
| 18.03.2022 22:00 - 23:00 | 0 | 0 | 0 | 0 |
| 18.03.2022 23:00 - 24:00 | 0 | 0 | 0 | 0 |
| 19.03.2022 00:00 - 01:00 | 0 | 0 | 0 | 0 |
| 19.03.2022 01:00 - 02:00 | 0 | 0 | 0 | 0 |
| 19.03.2022 02:00 - 03:00 | 0 | 0 | 0 | 0 |
| 19.03.2022 03:00 - 04:00 | 0 | 0 | 0 | 0 |
| 19.03.2022 04:00 - 05:00 | 0 | 0 | 0 | 0 |
| 19.03.2022 05:00 - 06:00 | 0 | 0 | 0 | 0 |
| 19.03.2022 06:00 - 07:00 | 0 | 0 | 0 | 0 |
| 19.03.2022 07:00 - 08:00 | 0 | 0 | 0 | 0 |
| 19.03.2022 08:00 - 09:00 | 0 | 0 | 0 | 0 |
| 19.03.2022 09:00 - 10:00 | 0 | 0 | 0 | 0 |
| 19.03.2022 10:00 - 11:00 | 0 | 0 | 0 | 0 |
| 19.03.2022 11:00 - 12:00 | 0 | 0 | 0 | 0 |
| 19.03.2022 12:00 - 13:00 | 0 | 0 | 0 | 0 |
| 19.03.2022 13:00 - 14:00 | 0 | 0 | 0 | 0 |
| 19.03.2022 14:00 - 15:00 | 0 | 0 | 0 | 0 |
| 19.03.2022 15:00 - 16:00 | 0 | 0 | 0 | 0 |
| 19.03.2022 16:00 - 17:00 | 0 | 0 | 0 | 0 |
| 19.03.2022 17:00 - 18:00 | 0 | 0 | 0 | 0 |
| 19.03.2022 18:00 - 19:00 | 0 | 0 | 0 | 0 |
| 19.03.2022 19:00 - 20:00 | 0 | 0 | 0 | 0 |
| 19.03.2022 20:00 - 21:00 | 0 | 0 | 0 | 0 |
| 19.03.2022 21:00 - 22:00 | 400 | 0 | 0 | 0 |
| 19.03.2022 22:00 - 23:00 | 400 | 0 | 0 | 0 |
| 19.03.2022 23:00 - 24:00 | 400 | 0 | 0 | 0 |
| 20.03.2022 00:00 - 01:00 | 400 | 0 | 0 | 0 |
| 20.03.2022 01:00 - 02:00 | 400 | 0 | 0 | 0 |
| 20.03.2022 02:00 - 03:00 | 400 | 0 | 0 | 0 |
| 20.03.2022 03:00 - 04:00 | 400 | 0 | 0 | 0 |
| 20.03.2022 04:00 - 05:00 | 400 | 0 | 0 | 0 |
| 20.03.2022 05:00 - 06:00 | 400 | 0 | 0 | 0 |
| 20.03.2022 06:00 - 07:00 | 0 | 0 | 0 | 0 |
| 20.03.2022 07:00 - 08:00 | 0 | 0 | 0 | 0 |
| 20.03.2022 08:00 - 09:00 | 0 | 0 | 0 | 0 |
| 20.03.2022 09:00 - 10:00 | 0 | 0 | 0 | 0 |
| 20.03.2022 10:00 - 11:00 | 0 | 0 | 0 | 0 |
| 20.03.2022 11:00 - 12:00 | 0 | 0 | 0 | 0 |
| 20.03.2022 12:00 - 13:00 | 0 | 0 | 0 | 0 |
| 20.03.2022 13:00 - 14:00 | 0 | 0 | 0 | 0 |
| 20.03.2022 14:00 - 15:00 | 0 | 0 | 0 | 0 |
| 20.03.2022 15:00 - 16:00 | 0 | 0 | 0 | 0 |
| 20.03.2022 16:00 - 17:00 | 0 | 0 | 0 | 0 |
| 20.03.2022 17:00 - 18:00 | 0 | 0 | 0 | 0 |
| 20.03.2022 18:00 - 19:00 | 0 | 0 | 0 | 0 |
| 20.03.2022 19:00 - 20:00 | 0 | 0 | 0 | 0 |
| 20.03.2022 20:00 - 21:00 | 0 | 0 | 0 | 0 |
| 20.03.2022 21:00 - 22:00 | 0 | 0 | 0 | 0 |
| 20.03.2022 22:00 - 23:00 | 0 | 0 | 0 | 0 |
| 20.03.2022 23:00 - 24:00 | 0 | 0 | 0 | 0 |
| 21.03.2022 00:00 - 01:00 | 0 | 0 | 0 | 0 |
| 21.03.2022 01:00 - 02:00 | 0 | 0 | 0 | 0 |
| 21.03.2022 02:00 - 03:00 | 0 | 0 | 0 | 0 |
| 21.03.2022 03:00 - 04:00 | 0 | 0 | 0 | 0 |
| 21.03.2022 04:00 - 05:00 | 0 | 0 | 0 | 0 |
| 21.03.2022 05:00 - 06:00 | 0 | 0 | 0 | 0 |
| 21.03.2022 06:00 - 07:00 | 0 | 0 | 0 | 0 |
| 21.03.2022 07:00 - 08:00 | 0 | 0 | 0 | 0 |
| 21.03.2022 08:00 - 09:00 | 0 | 0 | 0 | 0 |
| 21.03.2022 09:00 - 10:00 | 0 | 0 | 0 | 0 |
| 21.03.2022 10:00 - 11:00 | 0 | 0 | 0 | 0 |
| 21.03.2022 11:00 - 12:00 | 0 | 0 | 0 | 0 |
| 21.03.2022 12:00 - 13:00 | 0 | 0 | 0 | 0 |
| 21.03.2022 13:00 - 14:00 | 0 | 0 | 0 | 0 |
| 21.03.2022 14:00 - 15:00 | 0 | 0 | 0 | 0 |
| 21.03.2022 15:00 - 16:00 | 0 | 0 | 0 | 0 |
| 21.03.2022 16:00 - 17:00 | 0 | 0 | 0 | 0 |
| 21.03.2022 17:00 - 18:00 | 0 | 0 | 0 | 0 |
| 21.03.2022 18:00 - 19:00 | 0 | 0 | 0 | 0 |
| 21.03.2022 19:00 - 20:00 | 0 | 0 | 0 | 0 |
| 21.03.2022 20:00 - 21:00 | 0 | 0 | 0 | 0 |
| 21.03.2022 21:00 - 22:00 | 0 | 0 | 0 | 0 |
| 21.03.2022 22:00 - 23:00 | 0 | 0 | 0 | 0 |
| 21.03.2022 23:00 - 24:00 | 0 | 0 | 0 | 0 |
| 22.03.2022 00:00 - 01:00 | 0 | 0 | 0 | 0 |
| 22.03.2022 01:00 - 02:00 | 0 | 0 | 0 | 0 |
| 22.03.2022 02:00 - 03:00 | 0 | 0 | 0 | 0 |
| 22.03.2022 03:00 - 04:00 | 0 | 0 | 0 | 0 |
| 22.03.2022 04:00 - 05:00 | 0 | 0 | 0 | 0 |
| 22.03.2022 05:00 - 06:00 | 0 | 0 | 0 | 0 |
| 22.03.2022 06:00 - 07:00 | 0 | 0 | 0 | 0 |
| 22.03.2022 07:00 - 08:00 | 0 | 0 | 0 | 0 |
| 22.03.2022 08:00 - 09:00 | 0 | 0 | 0 | 0 |
| 22.03.2022 09:00 - 10:00 | 0 | 0 | 0 | 0 |
| 22.03.2022 10:00 - 11:00 | 0 | 0 | 0 | 0 |
| 22.03.2022 11:00 - 12:00 | 0 | 0 | 0 | 0 |
| 22.03.2022 12:00 - 13:00 | 0 | 0 | 0 | 0 |
| 22.03.2022 13:00 - 14:00 | 0 | 0 | 0 | 0 |
| 22.03.2022 14:00 - 15:00 | 0 | 0 | 0 | 0 |
| 22.03.2022 15:00 - 16:00 | 0 | 0 | 0 | 0 |
| 22.03.2022 16:00 - 17:00 | 0 | 0 | 0 | 0 |
| 22.03.2022 17:00 - 18:00 | 0 | 0 | 0 | 0 |
| 22.03.2022 18:00 - 19:00 | 0 | 0 | 0 | 0 |
| 22.03.2022 19:00 - 20:00 | 0 | 0 | 0 | 0 |
| 22.03.2022 20:00 - 21:00 | 0 | 0 | 0 | 0 |
| 22.03.2022 21:00 - 22:00 | 0 | 0 | 0 | 0 |
| 22.03.2022 22:00 - 23:00 | 0 | 0 | 0 | 0 |
| 22.03.2022 23:00 - 24:00 | 0 | 0 | 0 | 0 |
| 23.03.2022 00:00 - 01:00 | 0 | -600 | 0 | 0 |
| 23.03.2022 01:00 - 02:00 | 0 | -600 | 0 | 0 |
| 23.03.2022 02:00 - 03:00 | 0 | -600 | 0 | 0 |
| 23.03.2022 03:00 - 04:00 | 0 | -600 | 0 | 0 |
| 23.03.2022 04:00 - 05:00 | 0 | -600 | 0 | 0 |
| 23.03.2022 05:00 - 06:00 | 0 | -600 | 0 | 0 |
| 23.03.2022 06:00 - 07:00 | 0 | 0 | 0 | 0 |
| 23.03.2022 07:00 - 08:00 | 0 | 0 | 0 | 0 |
| 23.03.2022 08:00 - 09:00 | 0 | 0 | 0 | 0 |
| 23.03.2022 09:00 - 10:00 | 0 | 0 | 0 | 0 |
| 23.03.2022 10:00 - 11:00 | 0 | 0 | 0 | 0 |
| 23.03.2022 11:00 - 12:00 | 0 | 0 | 0 | 0 |
| 23.03.2022 12:00 - 13:00 | 0 | 0 | 0 | 0 |
| 23.03.2022 13:00 - 14:00 | 0 | 0 | 0 | 0 |
| 23.03.2022 14:00 - 15:00 | 0 | 0 | 0 | 0 |
| 23.03.2022 15:00 - 16:00 | 0 | 0 | 0 | 0 |
| 23.03.2022 16:00 - 17:00 | 0 | 0 | 0 | 0 |
| 23.03.2022 17:00 - 18:00 | 0 | 0 | 0 | 0 |
| 23.03.2022 18:00 - 19:00 | 0 | -300 | 0 | 0 |
| 23.03.2022 19:00 - 20:00 | 0 | -300 | 0 | 0 |
| 23.03.2022 20:00 - 21:00 | 0 | -300 | 0 | 0 |
| 23.03.2022 21:00 - 22:00 | 0 | -300 | 0 | 0 |
| 23.03.2022 22:00 - 23:00 | 0 | -900 | 0 | 0 |
| 23.03.2022 23:00 - 24:00 | 0 | -900 | 0 | 0 |
| 24.03.2022 00:00 - 01:00 | 0 | -900 | 0 | 0 |
| 24.03.2022 01:00 - 02:00 | 0 | -900 | 0 | 0 |
| 24.03.2022 02:00 - 03:00 | 0 | -900 | 0 | 0 |
| 24.03.2022 03:00 - 04:00 | 0 | -900 | 0 | 0 |
| 24.03.2022 04:00 - 05:00 | 0 | -900 | 0 | 0 |
| 24.03.2022 05:00 - 06:00 | 0 | -900 | 0 | 0 |
| 24.03.2022 06:00 - 07:00 | 0 | 0 | 0 | 0 |
| 24.03.2022 07:00 - 08:00 | 0 | 0 | 0 | 0 |
| 24.03.2022 08:00 - 09:00 | 0 | 0 | 0 | 0 |
| 24.03.2022 09:00 - 10:00 | 0 | 0 | 0 | 0 |
| 24.03.2022 10:00 - 11:00 | 0 | 0 | 0 | 0 |
| 24.03.2022 11:00 - 12:00 | 0 | 0 | 0 | 0 |
| 24.03.2022 12:00 - 13:00 | 0 | 0 | 0 | 0 |
| 24.03.2022 13:00 - 14:00 | 0 | 0 | 0 | 0 |
| 24.03.2022 14:00 - 15:00 | 0 | 0 | 0 | 0 |
| 24.03.2022 15:00 - 16:00 | 0 | 0 | 0 | 0 |
| 24.03.2022 16:00 - 17:00 | 0 | 0 | 0 | 0 |
| 24.03.2022 17:00 - 18:00 | 0 | 0 | 0 | 0 |
| 24.03.2022 18:00 - 19:00 | 0 | 0 | 0 | 0 |
| 24.03.2022 19:00 - 20:00 | 0 | -500 | 0 | 0 |
| 24.03.2022 20:00 - 21:00 | 0 | -500 | 0 | 0 |
| 24.03.2022 21:00 - 22:00 | 0 | -500 | 0 | 0 |
| 24.03.2022 22:00 - 23:00 | 0 | -500 | 0 | 0 |
| 24.03.2022 23:00 - 24:00 | 0 | -500 | 0 | 0 |
| 25.03.2022 00:00 - 01:00 | 0 | -500 | 0 | 0 |
| 25.03.2022 01:00 - 02:00 | 0 | -500 | 0 | 0 |
| 25.03.2022 02:00 - 03:00 | 0 | -1000 | 0 | 0 |
| 25.03.2022 03:00 - 04:00 | 0 | -1000 | 0 | 0 |
| 25.03.2022 04:00 - 05:00 | 0 | -1000 | 0 | 0 |
| 25.03.2022 05:00 - 06:00 | 0 | -1000 | 0 | 0 |
| 25.03.2022 06:00 - 07:00 | 0 | 0 | 0 | 0 |
| 25.03.2022 07:00 - 08:00 | 0 | 0 | 0 | 0 |
| 25.03.2022 08:00 - 09:00 | 0 | 0 | 0 | 0 |
| 25.03.2022 09:00 - 10:00 | 0 | 0 | 0 | 0 |
| 25.03.2022 10:00 - 11:00 | 0 | 0 | 0 | 0 |
| 25.03.2022 11:00 - 12:00 | 0 | 0 | 0 | 0 |
| 25.03.2022 12:00 - 13:00 | 0 | 0 | 0 | 0 |
| 25.03.2022 13:00 - 14:00 | 0 | 0 | 0 | 0 |
| 25.03.2022 14:00 - 15:00 | 0 | 0 | 0 | 0 |
| 25.03.2022 15:00 - 16:00 | 0 | 0 | 0 | 0 |
| 25.03.2022 16:00 - 17:00 | 0 | 0 | 0 | 0 |
| 25.03.2022 17:00 - 18:00 | 0 | 0 | 0 | 0 |
| 25.03.2022 18:00 - 19:00 | 0 | 0 | 0 | 0 |
| 25.03.2022 19:00 - 20:00 | 0 | 0 | 0 | 0 |
| 25.03.2022 20:00 - 21:00 | 0 | -272 | 0 | 0 |
| 25.03.2022 21:00 - 22:00 | 0 | -400 | 0 | 0 |
| 25.03.2022 22:00 - 23:00 | 0 | -400 | 0 | 0 |
| 25.03.2022 23:00 - 24:00 | 0 | -400 | 0 | 0 |
| 26.03.2022 00:00 - 01:00 | 0 | -400 | 0 | 0 |
| 26.03.2022 01:00 - 02:00 | 0 | -400 | 0 | 0 |
| 26.03.2022 02:00 - 03:00 | 0 | -400 | 0 | 0 |
| 26.03.2022 03:00 - 04:00 | 0 | -400 | 0 | 0 |
| 26.03.2022 04:00 - 05:00 | 0 | -400 | 0 | 0 |
| 26.03.2022 05:00 - 06:00 | 0 | -400 | 0 | 0 |
| 26.03.2022 06:00 - 07:00 | 0 | 0 | 0 | 0 |
| 26.03.2022 07:00 - 08:00 | 0 | 0 | 0 | 0 |
| 26.03.2022 08:00 - 09:00 | 0 | 0 | 0 | 0 |
| 26.03.2022 09:00 - 10:00 | 0 | 0 | 0 | 0 |
| 26.03.2022 10:00 - 11:00 | 0 | 0 | 0 | 0 |
| 26.03.2022 11:00 - 12:00 | 0 | 0 | 0 | 0 |
| 26.03.2022 12:00 - 13:00 | 0 | 0 | 0 | 0 |
| 26.03.2022 13:00 - 14:00 | 0 | 0 | 0 | 0 |
| 26.03.2022 14:00 - 15:00 | 0 | 0 | 0 | 0 |
| 26.03.2022 15:00 - 16:00 | 0 | 0 | 0 | 0 |
| 26.03.2022 16:00 - 17:00 | 0 | -300 | 0 | 0 |
| 26.03.2022 17:00 - 18:00 | 0 | -300 | 0 | 0 |
| 26.03.2022 18:00 - 19:00 | 0 | -300 | 0 | 0 |
| 26.03.2022 19:00 - 20:00 | 0 | -320 | 0 | 0 |
| 26.03.2022 20:00 - 21:00 | 0 | -320 | 0 | 0 |
| 26.03.2022 21:00 - 22:00 | 0 | -320 | 0 | 0 |
| 26.03.2022 22:00 - 23:00 | 0 | -320 | 0 | 0 |
| 26.03.2022 23:00 - 24:00 | 0 | -320 | 0 | 0 |
| 27.03.2022 00:00 - 01:00 | 0 | -320 | 0 | 0 |
| 27.03.2022 01:00 - 03:00 | 0 | -320 | 0 | 0 |
| 27.03.2022 03:00 - 04:00 | 0 | -320 | 0 | 0 |
| 27.03.2022 04:00 - 05:00 | 0 | -320 | 0 | 0 |
| 27.03.2022 05:00 - 06:00 | 0 | -320 | 0 | 0 |
| 27.03.2022 06:00 - 07:00 | 0 | 0 | 0 | 0 |
| 27.03.2022 07:00 - 08:00 | 0 | 0 | 0 | 0 |
| 27.03.2022 08:00 - 09:00 | 0 | 0 | 0 | 0 |
| 27.03.2022 09:00 - 10:00 | 0 | 0 | 0 | 0 |
| 27.03.2022 10:00 - 11:00 | 0 | 0 | 0 | 0 |
| 27.03.2022 11:00 - 12:00 | 0 | 0 | 0 | 0 |
| 27.03.2022 12:00 - 13:00 | 0 | 0 | 0 | 0 |
| 27.03.2022 13:00 - 14:00 | 0 | 0 | 0 | 0 |
| 27.03.2022 14:00 - 15:00 | 0 | 0 | 0 | 0 |
| 27.03.2022 15:00 - 16:00 | 0 | 0 | 0 | 0 |
| 27.03.2022 16:00 - 17:00 | 0 | 0 | 0 | 0 |
| 27.03.2022 17:00 - 18:00 | 0 | -200 | 0 | 0 |
| 27.03.2022 18:00 - 19:00 | 0 | -200 | 0 | 0 |
| 27.03.2022 19:00 - 20:00 | 0 | -200 | 0 | 0 |
| 27.03.2022 20:00 - 21:00 | 0 | -200 | 0 | 0 |
| 27.03.2022 21:00 - 22:00 | 0 | -200 | 0 | 0 |
| 27.03.2022 22:00 - 23:00 | 0 | -200 | 0 | 0 |
| 27.03.2022 23:00 - 24:00 | 0 | -200 | 0 | 0 |
| 28.03.2022 00:00 - 01:00 | 0 | -500 | 0 | 0 |
| 28.03.2022 01:00 - 02:00 | 0 | -500 | 0 | 0 |
| 28.03.2022 02:00 - 03:00 | 0 | -500 | 0 | 0 |
| 28.03.2022 03:00 - 04:00 | 0 | -500 | 0 | 0 |
| 28.03.2022 04:00 - 05:00 | 0 | -500 | 0 | 0 |
| 28.03.2022 05:00 - 06:00 | 0 | -500 | 0 | 0 |
| 28.03.2022 06:00 - 07:00 | 0 | 0 | 0 | 0 |
| 28.03.2022 07:00 - 08:00 | 0 | 0 | 0 | 0 |
| 28.03.2022 08:00 - 09:00 | 0 | 0 | 0 | 0 |
| 28.03.2022 09:00 - 10:00 | 0 | 0 | 0 | 0 |
| 28.03.2022 10:00 - 11:00 | 0 | 0 | 0 | 0 |
| 28.03.2022 11:00 - 12:00 | 0 | 0 | 0 | 0 |
| 28.03.2022 12:00 - 13:00 | 0 | 0 | 0 | 0 |
| 28.03.2022 13:00 - 14:00 | 0 | 0 | 0 | 0 |
| 28.03.2022 14:00 - 15:00 | 0 | 0 | 0 | 0 |
| 28.03.2022 15:00 - 16:00 | 0 | 0 | 0 | 0 |
| 28.03.2022 16:00 - 17:00 | 0 | 0 | 0 | 0 |
| 28.03.2022 17:00 - 18:00 | 0 | 0 | 0 | 0 |
| 28.03.2022 18:00 - 19:00 | 0 | 0 | 0 | 0 |
| 28.03.2022 19:00 - 20:00 | 0 | 0 | 0 | 0 |
| 28.03.2022 20:00 - 21:00 | 0 | 0 | 0 | 0 |
| 28.03.2022 21:00 - 22:00 | 0 | 0 | 0 | 0 |
| 28.03.2022 22:00 - 23:00 | 0 | 0 | 0 | 0 |
| 28.03.2022 23:00 - 24:00 | 0 | 0 | 0 | 0 |
| 29.03.2022 00:00 - 01:00 | 0 | 0 | 0 | 0 |
| 29.03.2022 01:00 - 02:00 | 0 | 0 | 0 | 0 |
| 29.03.2022 02:00 - 03:00 | 0 | 0 | 0 | 0 |
| 29.03.2022 03:00 - 04:00 | 0 | 0 | 0 | 0 |
| 29.03.2022 04:00 - 05:00 | 0 | 0 | 0 | 0 |
| 29.03.2022 05:00 - 06:00 | 0 | 0 | 0 | 0 |
| 29.03.2022 06:00 - 07:00 | 0 | 0 | 0 | 0 |
| 29.03.2022 07:00 - 08:00 | 0 | 0 | 0 | 0 |
| 29.03.2022 08:00 - 09:00 | 0 | 0 | 0 | 0 |
| 29.03.2022 09:00 - 10:00 | 0 | 0 | 0 | 0 |
| 29.03.2022 10:00 - 11:00 | 0 | 0 | 0 | 0 |
| 29.03.2022 11:00 - 12:00 | 0 | 0 | 0 | 0 |
| 29.03.2022 12:00 - 13:00 | 0 | 0 | 0 | 0 |
| 29.03.2022 13:00 - 14:00 | 0 | 0 | 0 | 0 |
| 29.03.2022 14:00 - 15:00 | 0 | 0 | 0 | 0 |
| 29.03.2022 15:00 - 16:00 | 0 | 0 | 0 | 0 |
| 29.03.2022 16:00 - 17:00 | 0 | 0 | 0 | 0 |
| 29.03.2022 17:00 - 18:00 | 0 | 0 | 0 | 0 |
| 29.03.2022 18:00 - 19:00 | 0 | 0 | 0 | 0 |
| 29.03.2022 19:00 - 20:00 | 0 | 0 | 0 | 0 |
| 29.03.2022 20:00 - 21:00 | 0 | 0 | 0 | 0 |
| 29.03.2022 21:00 - 22:00 | 0 | 0 | 0 | 0 |
| 29.03.2022 22:00 - 23:00 | 0 | 0 | 0 | 0 |
| 29.03.2022 23:00 - 24:00 | 0 | 0 | 0 | 0 |
| 30.03.2022 00:00 - 01:00 | 0 | 0 | 0 | 0 |
| 30.03.2022 01:00 - 02:00 | 0 | 0 | 0 | 0 |
| 30.03.2022 02:00 - 03:00 | 0 | 0 | 0 | 0 |
| 30.03.2022 03:00 - 04:00 | 0 | 0 | 0 | 0 |
| 30.03.2022 04:00 - 05:00 | 0 | 0 | 0 | 0 |
| 30.03.2022 05:00 - 06:00 | 0 | 0 | 0 | 0 |
| 30.03.2022 06:00 - 07:00 | 0 | 0 | 0 | 0 |
| 30.03.2022 07:00 - 08:00 | 0 | 0 | 0 | 0 |
| 30.03.2022 08:00 - 09:00 | 0 | 0 | 0 | 0 |
| 30.03.2022 09:00 - 10:00 | 0 | 0 | 0 | 0 |
| 30.03.2022 10:00 - 11:00 | 0 | 0 | 0 | 0 |
| 30.03.2022 11:00 - 12:00 | 0 | 0 | 0 | 0 |
| 30.03.2022 12:00 - 13:00 | 0 | 0 | 0 | 0 |
| 30.03.2022 13:00 - 14:00 | 0 | 0 | 0 | 0 |
| 30.03.2022 14:00 - 15:00 | 0 | 0 | 0 | 0 |
| 30.03.2022 15:00 - 16:00 | 0 | 0 | 0 | 0 |
| 30.03.2022 16:00 - 17:00 | 0 | 0 | 0 | 0 |
| 30.03.2022 17:00 - 18:00 | 0 | 0 | 0 | 0 |
| 30.03.2022 18:00 - 19:00 | 0 | 0 | 0 | 0 |
| 30.03.2022 19:00 - 20:00 | 0 | 0 | 0 | 0 |
| 30.03.2022 20:00 - 21:00 | 0 | 0 | 0 | 0 |
| 30.03.2022 21:00 - 22:00 | 0 | 0 | 0 | 0 |
| 30.03.2022 22:00 - 23:00 | 0 | 0 | 0 | 0 |
| 30.03.2022 23:00 - 24:00 | 0 | 0 | 0 | 0 |
| 31.03.2022 00:00 - 01:00 | 0 | 0 | 0 | 0 |
| 31.03.2022 01:00 - 02:00 | 0 | 0 | 0 | 0 |
| 31.03.2022 02:00 - 03:00 | 0 | 0 | 0 | 0 |
| 31.03.2022 03:00 - 04:00 | 0 | 0 | 0 | 0 |
| 31.03.2022 04:00 - 05:00 | 800 | 0 | 0 | 0 |
| 31.03.2022 05:00 - 06:00 | 800 | 0 | 0 | 0 |
| 31.03.2022 06:00 - 07:00 | 0 | 0 | 0 | 0 |
| 31.03.2022 07:00 - 08:00 | 0 | 0 | 0 | 0 |
| 31.03.2022 08:00 - 09:00 | 0 | 0 | 0 | 0 |
| 31.03.2022 09:00 - 10:00 | 0 | 0 | 0 | 0 |
| 31.03.2022 10:00 - 11:00 | 0 | 0 | 0 | 0 |
| 31.03.2022 11:00 - 12:00 | 0 | 0 | 0 | 0 |
| 31.03.2022 12:00 - 13:00 | 0 | 0 | 0 | 0 |
| 31.03.2022 13:00 - 14:00 | 0 | 0 | 0 | 0 |
| 31.03.2022 14:00 - 15:00 | 0 | 0 | 0 | 0 |
| 31.03.2022 15:00 - 16:00 | 0 | 0 | 0 | 0 |
| 31.03.2022 16:00 - 17:00 | 0 | 0 | 0 | 0 |
| 31.03.2022 17:00 - 18:00 | 0 | 0 | 0 | 0 |
| 31.03.2022 18:00 - 19:00 | 0 | 0 | 0 | 0 |
| 31.03.2022 19:00 - 20:00 | 0 | 0 | 0 | 0 |
| 31.03.2022 20:00 - 21:00 | 0 | 0 | 0 | 0 |
| 31.03.2022 21:00 - 22:00 | 0 | 0 | 0 | 0 |
| 31.03.2022 22:00 - 23:00 | 16 | 0 | 0 | 0 |
| 31.03.2022 23:00 - 24:00 | 400 | 0 | 0 | 0 |
| 01.04.2022 00:00 - 01:00 | 400 | 0 | 0 | 0 |
| 01.04.2022 01:00 - 02:00 | 400 | 0 | 0 | 0 |
| 01.04.2022 02:00 - 03:00 | 1200 | 0 | 0 | 0 |
| 01.04.2022 03:00 - 04:00 | 1200 | 0 | 0 | 0 |
| 01.04.2022 04:00 - 05:00 | 1200 | 0 | 0 | 0 |
| 01.04.2022 05:00 - 06:00 | 1200 | 0 | 0 | 0 |